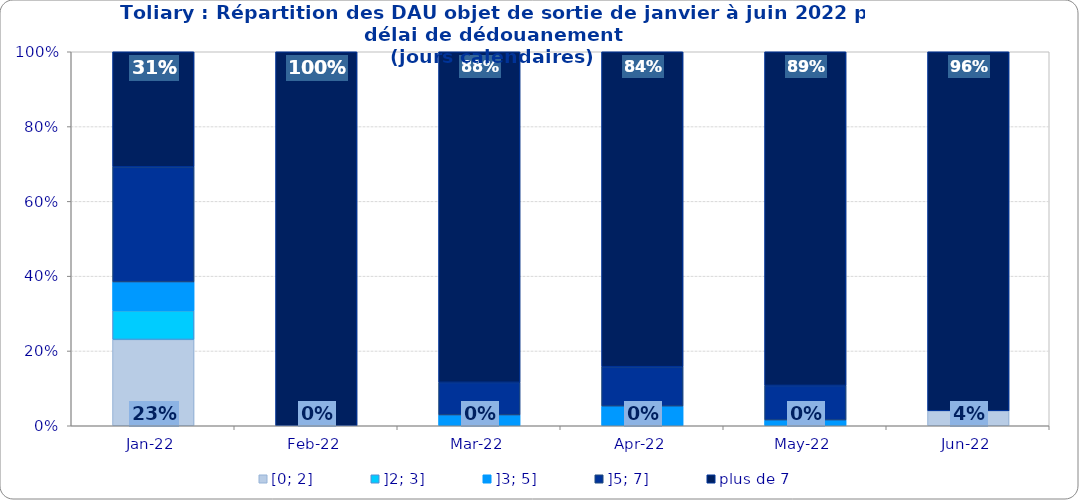
| Category | [0; 2] | ]2; 3] | ]3; 5] | ]5; 7] | plus de 7 |
|---|---|---|---|---|---|
| 2022-01-01 | 0.231 | 0.077 | 0.077 | 0.308 | 0.308 |
| 2022-02-01 | 0 | 0 | 0 | 0 | 1 |
| 2022-03-01 | 0 | 0 | 0.029 | 0.087 | 0.884 |
| 2022-04-01 | 0 | 0 | 0.053 | 0.105 | 0.842 |
| 2022-05-01 | 0 | 0 | 0.015 | 0.092 | 0.892 |
| 2022-06-01 | 0.04 | 0 | 0 | 0 | 0.96 |